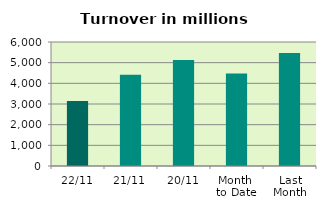
| Category | Series 0 |
|---|---|
| 22/11 | 3141.906 |
| 21/11 | 4410.037 |
| 20/11 | 5128.183 |
| Month 
to Date | 4480.729 |
| Last
Month | 5472.473 |